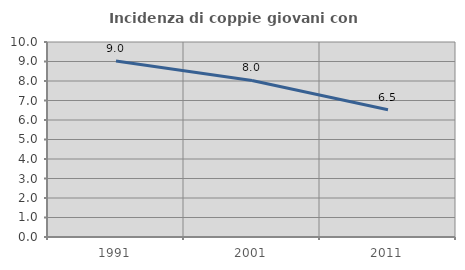
| Category | Incidenza di coppie giovani con figli |
|---|---|
| 1991.0 | 9.023 |
| 2001.0 | 8.029 |
| 2011.0 | 6.522 |